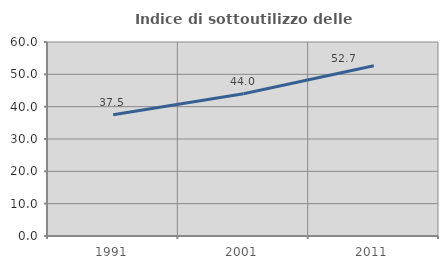
| Category | Indice di sottoutilizzo delle abitazioni  |
|---|---|
| 1991.0 | 37.524 |
| 2001.0 | 44.007 |
| 2011.0 | 52.661 |